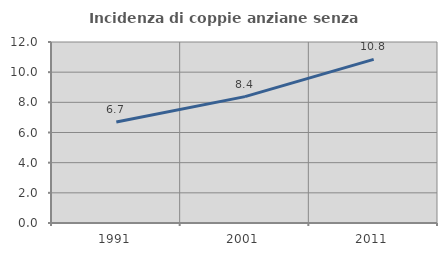
| Category | Incidenza di coppie anziane senza figli  |
|---|---|
| 1991.0 | 6.697 |
| 2001.0 | 8.377 |
| 2011.0 | 10.844 |